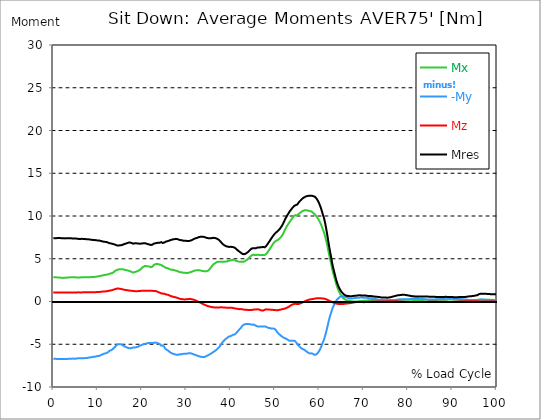
| Category |  Mx |  -My |  Mz |  Mres |
|---|---|---|---|---|
| 0.0 | 2.836 | -6.697 | 1.057 | 7.406 |
| 0.167348456675344 | 2.836 | -6.71 | 1.057 | 7.413 |
| 0.334696913350688 | 2.83 | -6.71 | 1.057 | 7.413 |
| 0.5020453700260321 | 2.823 | -6.717 | 1.057 | 7.413 |
| 0.669393826701376 | 2.823 | -6.71 | 1.057 | 7.406 |
| 0.83674228337672 | 2.823 | -6.717 | 1.057 | 7.413 |
| 1.0040907400520642 | 2.817 | -6.736 | 1.057 | 7.426 |
| 1.1621420602454444 | 2.804 | -6.736 | 1.057 | 7.426 |
| 1.3294905169207885 | 2.804 | -6.736 | 1.057 | 7.419 |
| 1.4968389735961325 | 2.798 | -6.736 | 1.057 | 7.419 |
| 1.6641874302714765 | 2.785 | -6.736 | 1.057 | 7.413 |
| 1.8315358869468206 | 2.765 | -6.736 | 1.057 | 7.406 |
| 1.9988843436221646 | 2.759 | -6.73 | 1.064 | 7.394 |
| 2.1662328002975086 | 2.759 | -6.723 | 1.064 | 7.387 |
| 2.333581256972853 | 2.772 | -6.723 | 1.064 | 7.387 |
| 2.5009297136481967 | 2.778 | -6.717 | 1.057 | 7.387 |
| 2.6682781703235405 | 2.778 | -6.71 | 1.057 | 7.381 |
| 2.8356266269988843 | 2.785 | -6.71 | 1.051 | 7.387 |
| 3.002975083674229 | 2.791 | -6.723 | 1.051 | 7.394 |
| 3.1703235403495724 | 2.804 | -6.717 | 1.051 | 7.394 |
| 3.337671997024917 | 2.804 | -6.71 | 1.057 | 7.394 |
| 3.4957233172182973 | 2.817 | -6.71 | 1.057 | 7.394 |
| 3.663071773893641 | 2.823 | -6.71 | 1.057 | 7.394 |
| 3.8304202305689854 | 2.83 | -6.704 | 1.057 | 7.387 |
| 3.997768687244329 | 2.836 | -6.691 | 1.064 | 7.387 |
| 4.165117143919673 | 2.843 | -6.685 | 1.064 | 7.381 |
| 4.332465600595017 | 2.836 | -6.678 | 1.064 | 7.374 |
| 4.499814057270361 | 2.836 | -6.678 | 1.064 | 7.368 |
| 4.667162513945706 | 2.83 | -6.685 | 1.064 | 7.374 |
| 4.834510970621049 | 2.83 | -6.685 | 1.064 | 7.374 |
| 5.001859427296393 | 2.823 | -6.685 | 1.064 | 7.374 |
| 5.169207883971737 | 2.817 | -6.685 | 1.064 | 7.368 |
| 5.336556340647081 | 2.817 | -6.665 | 1.064 | 7.348 |
| 5.503904797322425 | 2.81 | -6.646 | 1.07 | 7.336 |
| 5.671253253997769 | 2.81 | -6.639 | 1.07 | 7.323 |
| 5.82930457419115 | 2.81 | -6.633 | 1.064 | 7.316 |
| 5.996653030866494 | 2.81 | -6.627 | 1.064 | 7.31 |
| 6.164001487541838 | 2.83 | -6.627 | 1.064 | 7.316 |
| 6.331349944217181 | 2.836 | -6.633 | 1.064 | 7.329 |
| 6.498698400892526 | 2.836 | -6.639 | 1.07 | 7.336 |
| 6.66604685756787 | 2.83 | -6.633 | 1.07 | 7.323 |
| 6.833395314243213 | 2.83 | -6.627 | 1.07 | 7.316 |
| 7.000743770918558 | 2.83 | -6.633 | 1.07 | 7.323 |
| 7.168092227593902 | 2.823 | -6.62 | 1.07 | 7.31 |
| 7.335440684269246 | 2.83 | -6.594 | 1.07 | 7.29 |
| 7.50278914094459 | 2.836 | -6.588 | 1.07 | 7.284 |
| 7.6701375976199335 | 2.843 | -6.594 | 1.07 | 7.29 |
| 7.837486054295278 | 2.843 | -6.588 | 1.07 | 7.284 |
| 7.995537374488658 | 2.843 | -6.562 | 1.07 | 7.265 |
| 8.162885831164003 | 2.849 | -6.536 | 1.07 | 7.245 |
| 8.330234287839346 | 2.849 | -6.53 | 1.07 | 7.239 |
| 8.49758274451469 | 2.856 | -6.536 | 1.064 | 7.245 |
| 8.664931201190035 | 2.856 | -6.517 | 1.07 | 7.226 |
| 8.832279657865378 | 2.856 | -6.485 | 1.076 | 7.2 |
| 8.999628114540721 | 2.862 | -6.465 | 1.083 | 7.181 |
| 9.166976571216066 | 2.875 | -6.472 | 1.076 | 7.194 |
| 9.334325027891412 | 2.881 | -6.472 | 1.076 | 7.194 |
| 9.501673484566755 | 2.888 | -6.446 | 1.083 | 7.174 |
| 9.669021941242098 | 2.901 | -6.414 | 1.096 | 7.155 |
| 9.836370397917442 | 2.92 | -6.394 | 1.102 | 7.142 |
| 10.003718854592787 | 2.939 | -6.382 | 1.102 | 7.142 |
| 10.17106731126813 | 2.952 | -6.375 | 1.109 | 7.142 |
| 10.329118631461512 | 2.959 | -6.362 | 1.115 | 7.136 |
| 10.496467088136853 | 2.978 | -6.317 | 1.128 | 7.104 |
| 10.663815544812199 | 2.997 | -6.272 | 1.134 | 7.078 |
| 10.831164001487544 | 3.023 | -6.24 | 1.141 | 7.065 |
| 10.998512458162887 | 3.043 | -6.201 | 1.154 | 7.039 |
| 11.16586091483823 | 3.062 | -6.162 | 1.16 | 7.02 |
| 11.333209371513574 | 3.081 | -6.117 | 1.173 | 6.994 |
| 11.50055782818892 | 3.094 | -6.111 | 1.173 | 6.987 |
| 11.667906284864264 | 3.113 | -6.079 | 1.18 | 6.975 |
| 11.835254741539607 | 3.133 | -6.066 | 1.18 | 6.975 |
| 12.00260319821495 | 3.139 | -6.033 | 1.199 | 6.962 |
| 12.169951654890292 | 3.152 | -5.988 | 1.212 | 6.923 |
| 12.337300111565641 | 3.178 | -5.924 | 1.231 | 6.884 |
| 12.504648568240984 | 3.21 | -5.847 | 1.251 | 6.852 |
| 12.662699888434362 | 3.236 | -5.776 | 1.27 | 6.82 |
| 12.830048345109708 | 3.255 | -5.731 | 1.283 | 6.794 |
| 12.997396801785053 | 3.287 | -5.698 | 1.302 | 6.788 |
| 13.164745258460396 | 3.313 | -5.66 | 1.315 | 6.768 |
| 13.33209371513574 | 3.333 | -5.608 | 1.341 | 6.743 |
| 13.499442171811083 | 3.378 | -5.531 | 1.373 | 6.717 |
| 13.666790628486426 | 3.462 | -5.434 | 1.405 | 6.685 |
| 13.834139085161771 | 3.545 | -5.344 | 1.431 | 6.665 |
| 14.001487541837117 | 3.603 | -5.254 | 1.457 | 6.639 |
| 14.16883599851246 | 3.648 | -5.15 | 1.483 | 6.594 |
| 14.336184455187803 | 3.681 | -5.06 | 1.508 | 6.562 |
| 14.503532911863147 | 3.726 | -4.996 | 1.508 | 6.549 |
| 14.670881368538492 | 3.752 | -4.989 | 1.515 | 6.556 |
| 14.828932688731873 | 3.771 | -4.983 | 1.515 | 6.562 |
| 14.996281145407215 | 3.784 | -4.996 | 1.483 | 6.568 |
| 15.163629602082558 | 3.79 | -4.976 | 1.489 | 6.568 |
| 15.330978058757903 | 3.777 | -5.021 | 1.47 | 6.588 |
| 15.498326515433247 | 3.777 | -5.06 | 1.444 | 6.607 |
| 15.665674972108594 | 3.771 | -5.125 | 1.412 | 6.646 |
| 15.833023428783937 | 3.739 | -5.195 | 1.373 | 6.697 |
| 16.00037188545928 | 3.719 | -5.234 | 1.367 | 6.723 |
| 16.167720342134626 | 3.713 | -5.266 | 1.367 | 6.749 |
| 16.335068798809967 | 3.681 | -5.312 | 1.347 | 6.768 |
| 16.502417255485312 | 3.661 | -5.331 | 1.334 | 6.794 |
| 16.669765712160658 | 3.636 | -5.389 | 1.315 | 6.833 |
| 16.837114168836 | 3.61 | -5.434 | 1.302 | 6.865 |
| 17.004462625511344 | 3.597 | -5.453 | 1.289 | 6.891 |
| 17.16251394570472 | 3.571 | -5.486 | 1.276 | 6.917 |
| 17.32986240238007 | 3.532 | -5.473 | 1.27 | 6.891 |
| 17.497210859055414 | 3.494 | -5.46 | 1.263 | 6.865 |
| 17.664559315730756 | 3.455 | -5.44 | 1.257 | 6.839 |
| 17.8319077724061 | 3.384 | -5.389 | 1.231 | 6.762 |
| 17.999256229081443 | 3.378 | -5.37 | 1.225 | 6.762 |
| 18.166604685756788 | 3.403 | -5.382 | 1.225 | 6.781 |
| 18.333953142432133 | 3.442 | -5.389 | 1.212 | 6.801 |
| 18.501301599107478 | 3.468 | -5.363 | 1.212 | 6.807 |
| 18.668650055782823 | 3.494 | -5.35 | 1.205 | 6.801 |
| 18.835998512458165 | 3.513 | -5.337 | 1.193 | 6.801 |
| 19.00334696913351 | 3.545 | -5.305 | 1.205 | 6.794 |
| 19.170695425808855 | 3.597 | -5.26 | 1.218 | 6.781 |
| 19.338043882484197 | 3.648 | -5.208 | 1.231 | 6.768 |
| 19.496095202677576 | 3.706 | -5.15 | 1.244 | 6.755 |
| 19.66344365935292 | 3.758 | -5.137 | 1.238 | 6.768 |
| 19.830792116028263 | 3.855 | -5.099 | 1.251 | 6.781 |
| 19.998140572703612 | 3.958 | -5.06 | 1.257 | 6.788 |
| 20.165489029378953 | 4.009 | -5.028 | 1.257 | 6.801 |
| 20.3328374860543 | 4.061 | -4.996 | 1.251 | 6.813 |
| 20.500185942729644 | 4.119 | -4.97 | 1.257 | 6.826 |
| 20.667534399404985 | 4.145 | -4.957 | 1.257 | 6.826 |
| 20.83488285608033 | 4.151 | -4.938 | 1.263 | 6.801 |
| 21.002231312755672 | 4.138 | -4.912 | 1.257 | 6.768 |
| 21.16957976943102 | 4.125 | -4.88 | 1.263 | 6.736 |
| 21.336928226106362 | 4.106 | -4.867 | 1.27 | 6.71 |
| 21.504276682781704 | 4.1 | -4.86 | 1.27 | 6.697 |
| 21.67162513945705 | 4.087 | -4.854 | 1.27 | 6.665 |
| 21.82967645965043 | 4.048 | -4.854 | 1.263 | 6.633 |
| 21.997024916325774 | 4.016 | -4.847 | 1.257 | 6.607 |
| 22.16437337300112 | 4.009 | -4.847 | 1.257 | 6.601 |
| 22.33172182967646 | 4.067 | -4.867 | 1.244 | 6.646 |
| 22.499070286351806 | 4.164 | -4.86 | 1.238 | 6.704 |
| 22.666418743027148 | 4.28 | -4.835 | 1.238 | 6.768 |
| 22.833767199702496 | 4.325 | -4.809 | 1.244 | 6.788 |
| 23.00111565637784 | 4.358 | -4.802 | 1.225 | 6.807 |
| 23.168464113053183 | 4.383 | -4.815 | 1.205 | 6.826 |
| 23.335812569728528 | 4.403 | -4.828 | 1.186 | 6.846 |
| 23.50316102640387 | 4.403 | -4.854 | 1.154 | 6.865 |
| 23.670509483079215 | 4.377 | -4.905 | 1.102 | 6.871 |
| 23.83785793975456 | 4.345 | -4.912 | 1.07 | 6.852 |
| 23.995909259947936 | 4.306 | -4.989 | 1.031 | 6.878 |
| 24.163257716623285 | 4.306 | -5.099 | 0.986 | 6.929 |
| 24.330606173298627 | 4.28 | -5.157 | 0.948 | 6.942 |
| 24.49795462997397 | 4.222 | -5.131 | 0.935 | 6.891 |
| 24.665303086649313 | 4.151 | -5.137 | 0.928 | 6.846 |
| 24.83265154332466 | 4.1 | -5.189 | 0.922 | 6.846 |
| 25.0 | 4.067 | -5.292 | 0.909 | 6.891 |
| 25.167348456675345 | 3.997 | -5.46 | 0.864 | 6.955 |
| 25.334696913350694 | 3.939 | -5.556 | 0.838 | 6.994 |
| 25.502045370026035 | 3.926 | -5.627 | 0.819 | 7.026 |
| 25.669393826701377 | 3.906 | -5.66 | 0.806 | 7.039 |
| 25.836742283376722 | 3.881 | -5.718 | 0.78 | 7.065 |
| 26.004090740052067 | 3.848 | -5.789 | 0.754 | 7.097 |
| 26.17143919672741 | 3.797 | -5.872 | 0.716 | 7.129 |
| 26.329490516920792 | 3.752 | -5.95 | 0.67 | 7.162 |
| 26.49683897359613 | 3.732 | -5.995 | 0.632 | 7.194 |
| 26.66418743027148 | 3.719 | -6.04 | 0.606 | 7.22 |
| 26.831535886946828 | 3.706 | -6.079 | 0.587 | 7.245 |
| 26.998884343622166 | 3.7 | -6.117 | 0.561 | 7.271 |
| 27.166232800297514 | 3.687 | -6.143 | 0.541 | 7.29 |
| 27.333581256972852 | 3.661 | -6.169 | 0.516 | 7.29 |
| 27.5009297136482 | 3.629 | -6.195 | 0.496 | 7.303 |
| 27.668278170323543 | 3.61 | -6.22 | 0.477 | 7.316 |
| 27.835626626998888 | 3.597 | -6.233 | 0.458 | 7.316 |
| 28.002975083674233 | 3.565 | -6.233 | 0.425 | 7.303 |
| 28.170323540349575 | 3.52 | -6.233 | 0.393 | 7.278 |
| 28.33767199702492 | 3.468 | -6.195 | 0.355 | 7.22 |
| 28.50502045370026 | 3.436 | -6.175 | 0.322 | 7.187 |
| 28.663071773893645 | 3.416 | -6.175 | 0.297 | 7.181 |
| 28.830420230568986 | 3.416 | -6.175 | 0.284 | 7.181 |
| 28.99776868724433 | 3.403 | -6.162 | 0.277 | 7.162 |
| 29.165117143919673 | 3.384 | -6.137 | 0.258 | 7.129 |
| 29.33246560059502 | 3.371 | -6.117 | 0.251 | 7.11 |
| 29.499814057270367 | 3.365 | -6.111 | 0.245 | 7.104 |
| 29.66716251394571 | 3.365 | -6.104 | 0.245 | 7.097 |
| 29.834510970621054 | 3.352 | -6.104 | 0.251 | 7.097 |
| 30.00185942729639 | 3.339 | -6.098 | 0.258 | 7.091 |
| 30.169207883971744 | 3.339 | -6.091 | 0.264 | 7.091 |
| 30.33655634064708 | 3.345 | -6.072 | 0.277 | 7.091 |
| 30.50390479732243 | 3.371 | -6.053 | 0.29 | 7.084 |
| 30.671253253997772 | 3.391 | -6.04 | 0.297 | 7.091 |
| 30.829304574191156 | 3.416 | -6.046 | 0.29 | 7.11 |
| 30.996653030866494 | 3.442 | -6.053 | 0.284 | 7.129 |
| 31.164001487541842 | 3.474 | -6.085 | 0.271 | 7.168 |
| 31.331349944217187 | 3.5 | -6.117 | 0.251 | 7.207 |
| 31.498698400892525 | 3.539 | -6.15 | 0.232 | 7.258 |
| 31.666046857567874 | 3.578 | -6.188 | 0.206 | 7.303 |
| 31.833395314243212 | 3.616 | -6.22 | 0.18 | 7.348 |
| 32.00074377091856 | 3.629 | -6.246 | 0.142 | 7.374 |
| 32.1680922275939 | 3.648 | -6.272 | 0.103 | 7.406 |
| 32.33544068426925 | 3.655 | -6.304 | 0.064 | 7.432 |
| 32.50278914094459 | 3.642 | -6.336 | 0.019 | 7.464 |
| 32.670137597619934 | 3.648 | -6.369 | -0.019 | 7.497 |
| 32.83748605429528 | 3.648 | -6.401 | -0.064 | 7.529 |
| 33.004834510970625 | 3.648 | -6.433 | -0.103 | 7.555 |
| 33.162885831164004 | 3.629 | -6.452 | -0.148 | 7.561 |
| 33.33023428783935 | 3.61 | -6.465 | -0.187 | 7.568 |
| 33.497582744514695 | 3.59 | -6.485 | -0.232 | 7.574 |
| 33.664931201190036 | 3.571 | -6.491 | -0.271 | 7.568 |
| 33.83227965786538 | 3.558 | -6.491 | -0.316 | 7.561 |
| 33.99962811454073 | 3.539 | -6.491 | -0.355 | 7.555 |
| 34.16697657121607 | 3.526 | -6.478 | -0.393 | 7.535 |
| 34.33432502789141 | 3.526 | -6.433 | -0.432 | 7.49 |
| 34.50167348456676 | 3.526 | -6.394 | -0.464 | 7.452 |
| 34.6690219412421 | 3.552 | -6.349 | -0.503 | 7.426 |
| 34.83637039791744 | 3.59 | -6.304 | -0.535 | 7.413 |
| 35.00371885459279 | 3.648 | -6.259 | -0.561 | 7.4 |
| 35.17106731126814 | 3.739 | -6.208 | -0.587 | 7.387 |
| 35.338415767943474 | 3.842 | -6.156 | -0.606 | 7.387 |
| 35.49646708813686 | 3.951 | -6.117 | -0.625 | 7.406 |
| 35.6638155448122 | 4.055 | -6.053 | -0.645 | 7.406 |
| 35.831164001487544 | 4.177 | -5.995 | -0.657 | 7.426 |
| 35.998512458162885 | 4.293 | -5.937 | -0.67 | 7.445 |
| 36.165860914838234 | 4.383 | -5.879 | -0.683 | 7.458 |
| 36.333209371513576 | 4.435 | -5.827 | -0.696 | 7.439 |
| 36.50055782818892 | 4.467 | -5.763 | -0.703 | 7.406 |
| 36.667906284864266 | 4.544 | -5.692 | -0.716 | 7.394 |
| 36.83525474153961 | 4.602 | -5.621 | -0.716 | 7.368 |
| 37.002603198214956 | 4.628 | -5.544 | -0.716 | 7.323 |
| 37.1699516548903 | 4.654 | -5.466 | -0.716 | 7.278 |
| 37.337300111565646 | 4.654 | -5.376 | -0.703 | 7.207 |
| 37.50464856824098 | 4.654 | -5.279 | -0.69 | 7.129 |
| 37.66269988843437 | 4.66 | -5.163 | -0.683 | 7.046 |
| 37.83004834510971 | 4.648 | -5.028 | -0.683 | 6.936 |
| 37.99739680178505 | 4.641 | -4.899 | -0.683 | 6.833 |
| 38.16474525846039 | 4.654 | -4.783 | -0.683 | 6.749 |
| 38.33209371513574 | 4.654 | -4.66 | -0.696 | 6.665 |
| 38.49944217181109 | 4.648 | -4.544 | -0.703 | 6.581 |
| 38.666790628486424 | 4.66 | -4.48 | -0.709 | 6.543 |
| 38.83413908516178 | 4.673 | -4.403 | -0.716 | 6.498 |
| 39.001487541837115 | 4.68 | -4.332 | -0.722 | 6.459 |
| 39.16883599851246 | 4.686 | -4.28 | -0.728 | 6.433 |
| 39.336184455187805 | 4.718 | -4.203 | -0.735 | 6.414 |
| 39.503532911863154 | 4.751 | -4.132 | -0.741 | 6.394 |
| 39.670881368538495 | 4.77 | -4.08 | -0.741 | 6.382 |
| 39.83822982521384 | 4.809 | -4.1 | -0.741 | 6.427 |
| 39.996281145407224 | 4.815 | -4.055 | -0.741 | 6.401 |
| 40.163629602082565 | 4.835 | -3.997 | -0.735 | 6.382 |
| 40.33097805875791 | 4.86 | -3.951 | -0.741 | 6.375 |
| 40.498326515433256 | 4.88 | -3.906 | -0.754 | 6.369 |
| 40.6656749721086 | 4.886 | -3.874 | -0.78 | 6.349 |
| 40.83302342878393 | 4.86 | -3.861 | -0.799 | 6.324 |
| 41.00037188545929 | 4.802 | -3.829 | -0.812 | 6.259 |
| 41.16772034213463 | 4.764 | -3.719 | -0.838 | 6.169 |
| 41.33506879880997 | 4.738 | -3.642 | -0.844 | 6.104 |
| 41.50241725548531 | 4.712 | -3.552 | -0.851 | 6.033 |
| 41.66976571216066 | 4.686 | -3.442 | -0.864 | 5.95 |
| 41.837114168836 | 4.667 | -3.333 | -0.89 | 5.879 |
| 42.004462625511344 | 4.654 | -3.242 | -0.896 | 5.821 |
| 42.17181108218669 | 4.641 | -3.159 | -0.896 | 5.763 |
| 42.32986240238007 | 4.635 | -3.062 | -0.89 | 5.692 |
| 42.497210859055414 | 4.635 | -2.933 | -0.896 | 5.614 |
| 42.66455931573076 | 4.635 | -2.836 | -0.909 | 5.569 |
| 42.831907772406105 | 4.641 | -2.759 | -0.928 | 5.537 |
| 42.999256229081446 | 4.66 | -2.707 | -0.948 | 5.531 |
| 43.16660468575679 | 4.706 | -2.662 | -0.967 | 5.55 |
| 43.33395314243214 | 4.751 | -2.63 | -0.98 | 5.582 |
| 43.50130159910748 | 4.809 | -2.636 | -0.973 | 5.634 |
| 43.66865005578282 | 4.873 | -2.63 | -0.973 | 5.692 |
| 43.83599851245817 | 4.957 | -2.624 | -0.986 | 5.763 |
| 44.00334696913351 | 5.034 | -2.611 | -0.993 | 5.827 |
| 44.17069542580886 | 5.118 | -2.649 | -0.993 | 5.917 |
| 44.3380438824842 | 5.202 | -2.675 | -0.993 | 6.008 |
| 44.49609520267758 | 5.292 | -2.675 | -0.999 | 6.085 |
| 44.66344365935292 | 5.382 | -2.701 | -1.006 | 6.169 |
| 44.83079211602827 | 5.434 | -2.714 | -0.999 | 6.22 |
| 44.99814057270361 | 5.46 | -2.714 | -0.967 | 6.24 |
| 45.16548902937895 | 5.466 | -2.688 | -0.935 | 6.227 |
| 45.332837486054295 | 5.447 | -2.74 | -0.922 | 6.22 |
| 45.500185942729644 | 5.434 | -2.785 | -0.922 | 6.22 |
| 45.66753439940499 | 5.421 | -2.823 | -0.928 | 6.227 |
| 45.83488285608033 | 5.447 | -2.862 | -0.928 | 6.259 |
| 46.00223131275568 | 5.466 | -2.92 | -0.915 | 6.304 |
| 46.16957976943102 | 5.473 | -2.933 | -0.922 | 6.324 |
| 46.336928226106366 | 5.453 | -2.926 | -0.928 | 6.311 |
| 46.50427668278171 | 5.44 | -2.933 | -0.954 | 6.317 |
| 46.671625139457056 | 5.453 | -2.92 | -0.986 | 6.336 |
| 46.829676459650436 | 5.453 | -2.914 | -1.018 | 6.343 |
| 46.99702491632577 | 5.44 | -2.92 | -1.051 | 6.349 |
| 47.16437337300112 | 5.44 | -2.926 | -1.07 | 6.362 |
| 47.33172182967646 | 5.453 | -2.933 | -1.051 | 6.382 |
| 47.49907028635181 | 5.434 | -2.914 | -1.018 | 6.356 |
| 47.66641874302716 | 5.428 | -2.881 | -0.973 | 6.336 |
| 47.83376719970249 | 5.479 | -2.92 | -0.941 | 6.401 |
| 48.001115656377834 | 5.556 | -2.952 | -0.915 | 6.478 |
| 48.16846411305319 | 5.647 | -3.004 | -0.915 | 6.594 |
| 48.33581256972853 | 5.769 | -3.043 | -0.928 | 6.723 |
| 48.50316102640387 | 5.892 | -3.081 | -0.928 | 6.852 |
| 48.67050948307921 | 6.014 | -3.075 | -0.935 | 6.962 |
| 48.837857939754564 | 6.143 | -3.107 | -0.967 | 7.104 |
| 49.005206396429905 | 6.278 | -3.146 | -0.967 | 7.245 |
| 49.163257716623285 | 6.42 | -3.165 | -0.96 | 7.374 |
| 49.33060617329863 | 6.556 | -3.159 | -0.96 | 7.49 |
| 49.49795462997397 | 6.697 | -3.165 | -0.973 | 7.632 |
| 49.66530308664932 | 6.82 | -3.165 | -0.986 | 7.748 |
| 49.832651543324666 | 6.923 | -3.178 | -0.993 | 7.851 |
| 50.0 | 7.02 | -3.236 | -0.999 | 7.967 |
| 50.16734845667534 | 7.071 | -3.333 | -1.006 | 8.045 |
| 50.33469691335069 | 7.11 | -3.442 | -1.018 | 8.096 |
| 50.50204537002604 | 7.155 | -3.571 | -1.018 | 8.174 |
| 50.66939382670139 | 7.213 | -3.681 | -1.012 | 8.257 |
| 50.836742283376715 | 7.278 | -3.771 | -0.993 | 8.354 |
| 51.00409074005207 | 7.348 | -3.848 | -0.98 | 8.444 |
| 51.17143919672741 | 7.432 | -3.919 | -0.96 | 8.547 |
| 51.32949051692079 | 7.535 | -3.997 | -0.941 | 8.67 |
| 51.496838973596134 | 7.645 | -4.067 | -0.915 | 8.799 |
| 51.66418743027148 | 7.774 | -4.138 | -0.89 | 8.941 |
| 51.831535886946824 | 7.922 | -4.196 | -0.87 | 9.108 |
| 51.99888434362217 | 8.109 | -4.261 | -0.857 | 9.302 |
| 52.16623280029752 | 8.29 | -4.28 | -0.838 | 9.482 |
| 52.33358125697285 | 8.477 | -4.319 | -0.812 | 9.669 |
| 52.5009297136482 | 8.644 | -4.358 | -0.78 | 9.83 |
| 52.668278170323546 | 8.792 | -4.39 | -0.735 | 9.985 |
| 52.835626626998895 | 8.934 | -4.454 | -0.69 | 10.133 |
| 53.00297508367424 | 9.07 | -4.512 | -0.645 | 10.275 |
| 53.17032354034958 | 9.198 | -4.577 | -0.593 | 10.417 |
| 53.33767199702492 | 9.327 | -4.609 | -0.541 | 10.552 |
| 53.50502045370027 | 9.45 | -4.59 | -0.477 | 10.655 |
| 53.663071773893655 | 9.572 | -4.59 | -0.425 | 10.771 |
| 53.83042023056899 | 9.708 | -4.59 | -0.38 | 10.887 |
| 53.99776868724433 | 9.83 | -4.59 | -0.342 | 10.997 |
| 54.16511714391967 | 9.933 | -4.59 | -0.316 | 11.1 |
| 54.33246560059503 | 10.03 | -4.59 | -0.29 | 11.177 |
| 54.49981405727037 | 10.094 | -4.609 | -0.271 | 11.242 |
| 54.667162513945705 | 10.107 | -4.68 | -0.264 | 11.268 |
| 54.834510970621054 | 10.082 | -4.822 | -0.284 | 11.293 |
| 55.0018594272964 | 10.075 | -4.938 | -0.303 | 11.332 |
| 55.169207883971744 | 10.14 | -5.06 | -0.303 | 11.442 |
| 55.336556340647086 | 10.23 | -5.17 | -0.297 | 11.564 |
| 55.50390479732243 | 10.307 | -5.26 | -0.271 | 11.68 |
| 55.671253253997776 | 10.372 | -5.344 | -0.232 | 11.777 |
| 55.83860171067312 | 10.443 | -5.421 | -0.2 | 11.867 |
| 55.9966530308665 | 10.501 | -5.46 | -0.161 | 11.951 |
| 56.16400148754184 | 10.559 | -5.544 | -0.122 | 12.035 |
| 56.33134994421718 | 10.61 | -5.576 | -0.084 | 12.099 |
| 56.498698400892536 | 10.636 | -5.614 | -0.039 | 12.151 |
| 56.66604685756788 | 10.662 | -5.66 | 0.006 | 12.202 |
| 56.83339531424321 | 10.675 | -5.731 | 0.045 | 12.247 |
| 57.00074377091856 | 10.681 | -5.814 | 0.084 | 12.293 |
| 57.16809222759391 | 10.668 | -5.872 | 0.122 | 12.318 |
| 57.33544068426925 | 10.655 | -5.924 | 0.155 | 12.338 |
| 57.5027891409446 | 10.629 | -5.988 | 0.187 | 12.357 |
| 57.670137597619934 | 10.597 | -6.053 | 0.213 | 12.37 |
| 57.83748605429528 | 10.571 | -6.072 | 0.239 | 12.37 |
| 58.004834510970625 | 10.565 | -6.04 | 0.251 | 12.376 |
| 58.16288583116401 | 10.546 | -6.066 | 0.264 | 12.383 |
| 58.330234287839346 | 10.494 | -6.098 | 0.277 | 12.37 |
| 58.497582744514695 | 10.417 | -6.098 | 0.297 | 12.318 |
| 58.66493120119004 | 10.339 | -6.175 | 0.309 | 12.312 |
| 58.832279657865385 | 10.262 | -6.22 | 0.322 | 12.293 |
| 58.999628114540734 | 10.191 | -6.24 | 0.342 | 12.254 |
| 59.16697657121607 | 10.088 | -6.214 | 0.355 | 12.17 |
| 59.33432502789142 | 9.972 | -6.169 | 0.374 | 12.061 |
| 59.50167348456676 | 9.85 | -6.111 | 0.387 | 11.932 |
| 59.66902194124211 | 9.721 | -6.014 | 0.387 | 11.79 |
| 59.83637039791745 | 9.579 | -5.892 | 0.387 | 11.616 |
| 60.00371885459278 | 9.424 | -5.75 | 0.38 | 11.422 |
| 60.17106731126813 | 9.256 | -5.589 | 0.374 | 11.21 |
| 60.33841576794349 | 9.063 | -5.395 | 0.374 | 10.971 |
| 60.49646708813685 | 8.857 | -5.183 | 0.367 | 10.694 |
| 60.6638155448122 | 8.625 | -4.951 | 0.361 | 10.397 |
| 60.831164001487544 | 8.386 | -4.725 | 0.355 | 10.107 |
| 60.99851245816289 | 8.161 | -4.532 | 0.342 | 9.856 |
| 61.16586091483824 | 7.877 | -4.261 | 0.322 | 9.508 |
| 61.333209371513576 | 7.555 | -3.964 | 0.297 | 9.108 |
| 61.50055782818892 | 7.213 | -3.648 | 0.271 | 8.67 |
| 61.667906284864266 | 6.839 | -3.294 | 0.239 | 8.167 |
| 61.835254741539615 | 6.446 | -2.939 | 0.2 | 7.658 |
| 62.002603198214956 | 6.021 | -2.546 | 0.155 | 7.11 |
| 62.16995165489029 | 5.608 | -2.192 | 0.11 | 6.588 |
| 62.33730011156564 | 5.195 | -1.863 | 0.064 | 6.091 |
| 62.504648568240995 | 4.796 | -1.56 | 0.019 | 5.614 |
| 62.67199702491633 | 4.416 | -1.315 | -0.019 | 5.189 |
| 62.83004834510971 | 3.964 | -0.999 | -0.058 | 4.654 |
| 62.99739680178505 | 3.584 | -0.761 | -0.09 | 4.222 |
| 63.1647452584604 | 3.242 | -0.561 | -0.122 | 3.842 |
| 63.33209371513575 | 2.926 | -0.4 | -0.155 | 3.5 |
| 63.4994421718111 | 2.611 | -0.213 | -0.187 | 3.152 |
| 63.666790628486424 | 2.308 | -0.064 | -0.213 | 2.823 |
| 63.83413908516177 | 1.992 | 0.103 | -0.239 | 2.482 |
| 64.00148754183712 | 1.74 | 0.232 | -0.264 | 2.211 |
| 64.16883599851248 | 1.515 | 0.322 | -0.277 | 1.972 |
| 64.3361844551878 | 1.296 | 0.393 | -0.284 | 1.747 |
| 64.50353291186315 | 1.109 | 0.458 | -0.29 | 1.566 |
| 64.6708813685385 | 0.915 | 0.548 | -0.29 | 1.399 |
| 64.83822982521384 | 0.767 | 0.567 | -0.297 | 1.257 |
| 65.00557828188919 | 0.632 | 0.599 | -0.29 | 1.134 |
| 65.16362960208257 | 0.522 | 0.606 | -0.29 | 1.025 |
| 65.3309780587579 | 0.425 | 0.606 | -0.284 | 0.928 |
| 65.49832651543326 | 0.348 | 0.58 | -0.277 | 0.851 |
| 65.6656749721086 | 0.277 | 0.554 | -0.271 | 0.786 |
| 65.83302342878395 | 0.219 | 0.535 | -0.258 | 0.735 |
| 66.00037188545929 | 0.174 | 0.509 | -0.245 | 0.696 |
| 66.16772034213463 | 0.148 | 0.477 | -0.239 | 0.67 |
| 66.33506879880998 | 0.122 | 0.438 | -0.226 | 0.645 |
| 66.50241725548531 | 0.103 | 0.4 | -0.219 | 0.645 |
| 66.66976571216065 | 0.084 | 0.374 | -0.206 | 0.632 |
| 66.83711416883601 | 0.064 | 0.361 | -0.193 | 0.625 |
| 67.00446262551135 | 0.052 | 0.348 | -0.187 | 0.612 |
| 67.1718110821867 | 0.026 | 0.355 | -0.168 | 0.619 |
| 67.32986240238007 | 0.013 | 0.361 | -0.155 | 0.619 |
| 67.49721085905541 | 0.006 | 0.374 | -0.135 | 0.632 |
| 67.66455931573076 | 0.006 | 0.367 | -0.122 | 0.651 |
| 67.83190777240611 | 0.013 | 0.374 | -0.11 | 0.657 |
| 67.99925622908145 | 0.006 | 0.406 | -0.09 | 0.67 |
| 68.16660468575678 | 0 | 0.413 | -0.077 | 0.677 |
| 68.33395314243214 | 0 | 0.425 | -0.064 | 0.683 |
| 68.50130159910749 | 0.013 | 0.445 | -0.058 | 0.696 |
| 68.66865005578282 | 0.019 | 0.445 | -0.052 | 0.709 |
| 68.83599851245816 | 0.032 | 0.438 | -0.058 | 0.722 |
| 69.00334696913352 | 0.045 | 0.451 | -0.064 | 0.728 |
| 69.17069542580886 | 0.058 | 0.451 | -0.071 | 0.728 |
| 69.3380438824842 | 0.058 | 0.458 | -0.071 | 0.716 |
| 69.50539233915956 | 0.058 | 0.464 | -0.064 | 0.716 |
| 69.66344365935292 | 0.071 | 0.458 | -0.064 | 0.709 |
| 69.83079211602826 | 0.09 | 0.445 | -0.071 | 0.709 |
| 69.99814057270362 | 0.097 | 0.445 | -0.077 | 0.703 |
| 70.16548902937896 | 0.11 | 0.451 | -0.084 | 0.703 |
| 70.33283748605429 | 0.11 | 0.458 | -0.071 | 0.703 |
| 70.50018594272964 | 0.11 | 0.458 | -0.064 | 0.69 |
| 70.667534399405 | 0.122 | 0.438 | -0.052 | 0.677 |
| 70.83488285608033 | 0.135 | 0.419 | -0.052 | 0.657 |
| 71.00223131275568 | 0.142 | 0.413 | -0.045 | 0.651 |
| 71.16957976943102 | 0.135 | 0.4 | -0.032 | 0.638 |
| 71.33692822610637 | 0.148 | 0.38 | -0.032 | 0.632 |
| 71.50427668278171 | 0.161 | 0.387 | -0.032 | 0.638 |
| 71.67162513945706 | 0.168 | 0.393 | -0.026 | 0.638 |
| 71.8389735961324 | 0.168 | 0.38 | -0.026 | 0.632 |
| 71.99702491632577 | 0.174 | 0.355 | -0.019 | 0.606 |
| 72.16437337300113 | 0.174 | 0.329 | -0.019 | 0.593 |
| 72.33172182967647 | 0.174 | 0.322 | -0.013 | 0.593 |
| 72.49907028635181 | 0.174 | 0.303 | -0.006 | 0.574 |
| 72.66641874302715 | 0.18 | 0.284 | -0.006 | 0.561 |
| 72.8337671997025 | 0.18 | 0.277 | 0 | 0.554 |
| 73.00111565637783 | 0.18 | 0.258 | 0 | 0.548 |
| 73.16846411305319 | 0.18 | 0.239 | 0 | 0.541 |
| 73.33581256972853 | 0.18 | 0.219 | 0 | 0.535 |
| 73.50316102640387 | 0.18 | 0.206 | 0 | 0.522 |
| 73.67050948307921 | 0.174 | 0.2 | 0.006 | 0.509 |
| 73.83785793975457 | 0.168 | 0.187 | 0.006 | 0.483 |
| 74.00520639642991 | 0.168 | 0.174 | 0.006 | 0.471 |
| 74.16325771662328 | 0.168 | 0.161 | 0.006 | 0.464 |
| 74.33060617329863 | 0.168 | 0.161 | 0.006 | 0.464 |
| 74.49795462997398 | 0.174 | 0.155 | 0.006 | 0.471 |
| 74.66530308664932 | 0.168 | 0.155 | 0.013 | 0.464 |
| 74.83265154332466 | 0.161 | 0.155 | 0.013 | 0.458 |
| 75.00000000000001 | 0.155 | 0.155 | 0.013 | 0.458 |
| 75.16734845667534 | 0.148 | 0.148 | 0.013 | 0.451 |
| 75.3346969133507 | 0.148 | 0.148 | 0.019 | 0.445 |
| 75.50204537002605 | 0.148 | 0.129 | 0.019 | 0.445 |
| 75.66939382670138 | 0.142 | 0.155 | 0.026 | 0.471 |
| 75.83674228337672 | 0.148 | 0.161 | 0.026 | 0.483 |
| 76.00409074005208 | 0.148 | 0.155 | 0.026 | 0.49 |
| 76.17143919672742 | 0.148 | 0.161 | 0.026 | 0.516 |
| 76.33878765340276 | 0.155 | 0.18 | 0.019 | 0.541 |
| 76.49683897359614 | 0.155 | 0.161 | 0.019 | 0.567 |
| 76.66418743027148 | 0.142 | 0.155 | 0.026 | 0.587 |
| 76.83153588694682 | 0.142 | 0.161 | 0.032 | 0.606 |
| 76.99888434362218 | 0.148 | 0.161 | 0.026 | 0.632 |
| 77.16623280029752 | 0.155 | 0.18 | 0.019 | 0.664 |
| 77.33358125697285 | 0.148 | 0.206 | 0.026 | 0.677 |
| 77.5009297136482 | 0.161 | 0.219 | 0.013 | 0.703 |
| 77.66827817032356 | 0.168 | 0.232 | 0.006 | 0.728 |
| 77.83562662699889 | 0.168 | 0.239 | 0 | 0.741 |
| 78.00297508367423 | 0.168 | 0.251 | 0 | 0.741 |
| 78.17032354034959 | 0.168 | 0.264 | 0 | 0.741 |
| 78.33767199702493 | 0.187 | 0.251 | -0.013 | 0.761 |
| 78.50502045370027 | 0.2 | 0.258 | -0.026 | 0.78 |
| 78.67236891037561 | 0.193 | 0.264 | -0.026 | 0.78 |
| 78.83042023056899 | 0.187 | 0.264 | -0.032 | 0.78 |
| 78.99776868724433 | 0.2 | 0.264 | -0.039 | 0.793 |
| 79.16511714391969 | 0.206 | 0.277 | -0.045 | 0.786 |
| 79.33246560059503 | 0.206 | 0.271 | -0.045 | 0.774 |
| 79.49981405727036 | 0.206 | 0.277 | -0.045 | 0.754 |
| 79.66716251394571 | 0.206 | 0.277 | -0.045 | 0.741 |
| 79.83451097062107 | 0.193 | 0.264 | -0.045 | 0.722 |
| 80.00185942729641 | 0.193 | 0.264 | -0.045 | 0.716 |
| 80.16920788397174 | 0.2 | 0.271 | -0.052 | 0.696 |
| 80.33655634064709 | 0.206 | 0.277 | -0.052 | 0.683 |
| 80.50390479732243 | 0.206 | 0.309 | -0.064 | 0.651 |
| 80.67125325399778 | 0.206 | 0.309 | -0.071 | 0.645 |
| 80.83860171067312 | 0.2 | 0.329 | -0.071 | 0.632 |
| 80.99665303086651 | 0.187 | 0.335 | -0.064 | 0.619 |
| 81.16400148754184 | 0.187 | 0.335 | -0.071 | 0.619 |
| 81.3313499442172 | 0.174 | 0.335 | -0.064 | 0.606 |
| 81.49869840089255 | 0.18 | 0.335 | -0.071 | 0.599 |
| 81.66604685756786 | 0.18 | 0.342 | -0.071 | 0.593 |
| 81.83339531424322 | 0.193 | 0.342 | -0.077 | 0.599 |
| 82.00074377091858 | 0.187 | 0.348 | -0.071 | 0.593 |
| 82.16809222759392 | 0.18 | 0.355 | -0.071 | 0.593 |
| 82.33544068426926 | 0.18 | 0.335 | -0.071 | 0.593 |
| 82.50278914094459 | 0.18 | 0.322 | -0.071 | 0.587 |
| 82.67013759761994 | 0.187 | 0.303 | -0.071 | 0.587 |
| 82.83748605429528 | 0.187 | 0.303 | -0.064 | 0.587 |
| 83.00483451097062 | 0.174 | 0.303 | -0.064 | 0.58 |
| 83.17218296764597 | 0.18 | 0.297 | -0.058 | 0.574 |
| 83.33023428783935 | 0.187 | 0.284 | -0.058 | 0.567 |
| 83.4975827445147 | 0.174 | 0.284 | -0.052 | 0.587 |
| 83.66493120119004 | 0.187 | 0.271 | -0.058 | 0.593 |
| 83.83227965786537 | 0.193 | 0.258 | -0.058 | 0.599 |
| 83.99962811454073 | 0.2 | 0.251 | -0.058 | 0.593 |
| 84.16697657121607 | 0.2 | 0.251 | -0.052 | 0.587 |
| 84.33432502789142 | 0.193 | 0.245 | -0.052 | 0.587 |
| 84.50167348456677 | 0.193 | 0.245 | -0.045 | 0.574 |
| 84.6690219412421 | 0.187 | 0.239 | -0.039 | 0.567 |
| 84.83637039791745 | 0.18 | 0.232 | -0.032 | 0.554 |
| 85.0037188545928 | 0.18 | 0.226 | -0.032 | 0.554 |
| 85.17106731126813 | 0.18 | 0.226 | -0.026 | 0.554 |
| 85.33841576794349 | 0.18 | 0.232 | -0.026 | 0.554 |
| 85.50576422461883 | 0.187 | 0.232 | -0.032 | 0.554 |
| 85.66381554481221 | 0.187 | 0.226 | -0.039 | 0.554 |
| 85.83116400148755 | 0.193 | 0.226 | -0.039 | 0.561 |
| 85.99851245816289 | 0.187 | 0.239 | -0.039 | 0.554 |
| 86.16586091483823 | 0.187 | 0.251 | -0.039 | 0.541 |
| 86.33320937151358 | 0.18 | 0.264 | -0.032 | 0.529 |
| 86.50055782818893 | 0.193 | 0.258 | -0.039 | 0.522 |
| 86.66790628486427 | 0.2 | 0.251 | -0.039 | 0.522 |
| 86.83525474153961 | 0.206 | 0.258 | -0.045 | 0.522 |
| 87.00260319821496 | 0.206 | 0.271 | -0.045 | 0.522 |
| 87.16995165489031 | 0.193 | 0.284 | -0.039 | 0.522 |
| 87.33730011156564 | 0.193 | 0.29 | -0.039 | 0.522 |
| 87.504648568241 | 0.2 | 0.309 | -0.039 | 0.529 |
| 87.67199702491634 | 0.2 | 0.335 | -0.039 | 0.529 |
| 87.83004834510972 | 0.2 | 0.367 | -0.039 | 0.522 |
| 87.99739680178506 | 0.2 | 0.393 | -0.045 | 0.535 |
| 88.1647452584604 | 0.2 | 0.406 | -0.039 | 0.541 |
| 88.33209371513574 | 0.2 | 0.413 | -0.039 | 0.541 |
| 88.49944217181108 | 0.206 | 0.432 | -0.045 | 0.548 |
| 88.66679062848644 | 0.206 | 0.432 | -0.045 | 0.548 |
| 88.83413908516178 | 0.206 | 0.425 | -0.045 | 0.535 |
| 89.00148754183712 | 0.219 | 0.413 | -0.045 | 0.522 |
| 89.16883599851246 | 0.226 | 0.413 | -0.052 | 0.522 |
| 89.33618445518782 | 0.226 | 0.419 | -0.052 | 0.522 |
| 89.50353291186315 | 0.226 | 0.425 | -0.045 | 0.522 |
| 89.6708813685385 | 0.226 | 0.425 | -0.045 | 0.522 |
| 89.83822982521386 | 0.232 | 0.425 | -0.045 | 0.522 |
| 90.00557828188919 | 0.232 | 0.419 | -0.045 | 0.522 |
| 90.16362960208257 | 0.239 | 0.406 | -0.045 | 0.516 |
| 90.3309780587579 | 0.232 | 0.393 | -0.039 | 0.503 |
| 90.49832651543326 | 0.226 | 0.387 | -0.039 | 0.49 |
| 90.66567497210859 | 0.219 | 0.387 | -0.032 | 0.49 |
| 90.83302342878395 | 0.219 | 0.38 | -0.032 | 0.483 |
| 91.00037188545929 | 0.219 | 0.367 | -0.026 | 0.49 |
| 91.16772034213463 | 0.213 | 0.348 | -0.013 | 0.496 |
| 91.33506879880998 | 0.206 | 0.335 | -0.006 | 0.509 |
| 91.50241725548533 | 0.2 | 0.335 | -0.006 | 0.522 |
| 91.66976571216065 | 0.187 | 0.329 | 0 | 0.522 |
| 91.83711416883601 | 0.18 | 0.316 | 0.006 | 0.522 |
| 92.00446262551137 | 0.18 | 0.297 | 0.006 | 0.522 |
| 92.1718110821867 | 0.187 | 0.277 | 0.006 | 0.529 |
| 92.33915953886203 | 0.174 | 0.271 | 0.013 | 0.522 |
| 92.49721085905541 | 0.174 | 0.251 | 0.013 | 0.516 |
| 92.66455931573077 | 0.174 | 0.239 | 0.013 | 0.522 |
| 92.83190777240611 | 0.174 | 0.232 | 0.019 | 0.529 |
| 92.99925622908145 | 0.174 | 0.232 | 0.026 | 0.535 |
| 93.1666046857568 | 0.168 | 0.226 | 0.032 | 0.548 |
| 93.33395314243214 | 0.168 | 0.219 | 0.032 | 0.567 |
| 93.50130159910749 | 0.168 | 0.2 | 0.032 | 0.58 |
| 93.66865005578283 | 0.174 | 0.187 | 0.026 | 0.587 |
| 93.83599851245818 | 0.174 | 0.174 | 0.019 | 0.599 |
| 94.00334696913353 | 0.174 | 0.18 | 0.026 | 0.612 |
| 94.17069542580886 | 0.18 | 0.18 | 0.026 | 0.619 |
| 94.3380438824842 | 0.18 | 0.18 | 0.032 | 0.625 |
| 94.50539233915954 | 0.18 | 0.168 | 0.032 | 0.632 |
| 94.66344365935292 | 0.18 | 0.148 | 0.039 | 0.638 |
| 94.83079211602828 | 0.187 | 0.129 | 0.032 | 0.657 |
| 94.99814057270362 | 0.18 | 0.129 | 0.032 | 0.677 |
| 95.16548902937897 | 0.18 | 0.142 | 0.032 | 0.69 |
| 95.33283748605432 | 0.18 | 0.135 | 0.032 | 0.703 |
| 95.50018594272963 | 0.187 | 0.116 | 0.032 | 0.716 |
| 95.66753439940499 | 0.193 | 0.103 | 0.026 | 0.741 |
| 95.83488285608034 | 0.193 | 0.155 | 0.019 | 0.793 |
| 96.00223131275567 | 0.193 | 0.2 | 0.013 | 0.851 |
| 96.16957976943102 | 0.2 | 0.232 | 0.006 | 0.89 |
| 96.33692822610638 | 0.2 | 0.245 | 0 | 0.902 |
| 96.50427668278171 | 0.2 | 0.245 | 0 | 0.915 |
| 96.67162513945706 | 0.2 | 0.245 | 0.006 | 0.909 |
| 96.8389735961324 | 0.2 | 0.232 | 0.006 | 0.902 |
| 96.99702491632577 | 0.206 | 0.213 | 0 | 0.909 |
| 97.16437337300111 | 0.213 | 0.2 | -0.006 | 0.915 |
| 97.33172182967647 | 0.213 | 0.206 | -0.006 | 0.915 |
| 97.49907028635181 | 0.206 | 0.2 | 0 | 0.896 |
| 97.66641874302715 | 0.206 | 0.2 | 0 | 0.896 |
| 97.8337671997025 | 0.206 | 0.193 | 0.006 | 0.89 |
| 98.00111565637785 | 0.206 | 0.18 | 0.006 | 0.883 |
| 98.16846411305319 | 0.213 | 0.174 | 0 | 0.883 |
| 98.33581256972855 | 0.213 | 0.155 | 0.006 | 0.877 |
| 98.50316102640389 | 0.206 | 0.148 | 0.013 | 0.857 |
| 98.67050948307921 | 0.187 | 0.155 | 0.019 | 0.851 |
| 98.83785793975456 | 0.193 | 0.148 | 0.013 | 0.844 |
| 99.0052063964299 | 0.193 | 0.142 | 0.013 | 0.851 |
| 99.17255485310525 | 0.18 | 0.148 | 0.013 | 0.857 |
| 99.33060617329863 | 0.18 | 0.155 | 0.006 | 0.857 |
| 99.49795462997399 | 0.174 | 0.168 | 0.013 | 0.851 |
| 99.66530308664933 | 0.174 | 0.174 | 0.013 | 0.844 |
| 99.83265154332467 | 0.174 | 0.168 | 0.006 | 0.844 |
| 100.0 | 0.187 | 0.161 | 0.006 | 0.844 |